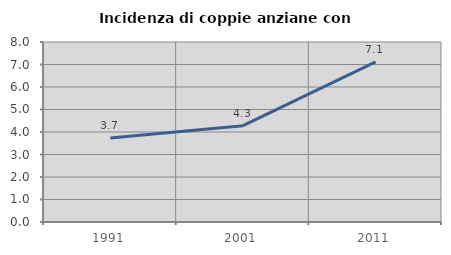
| Category | Incidenza di coppie anziane con figli |
|---|---|
| 1991.0 | 3.734 |
| 2001.0 | 4.28 |
| 2011.0 | 7.115 |